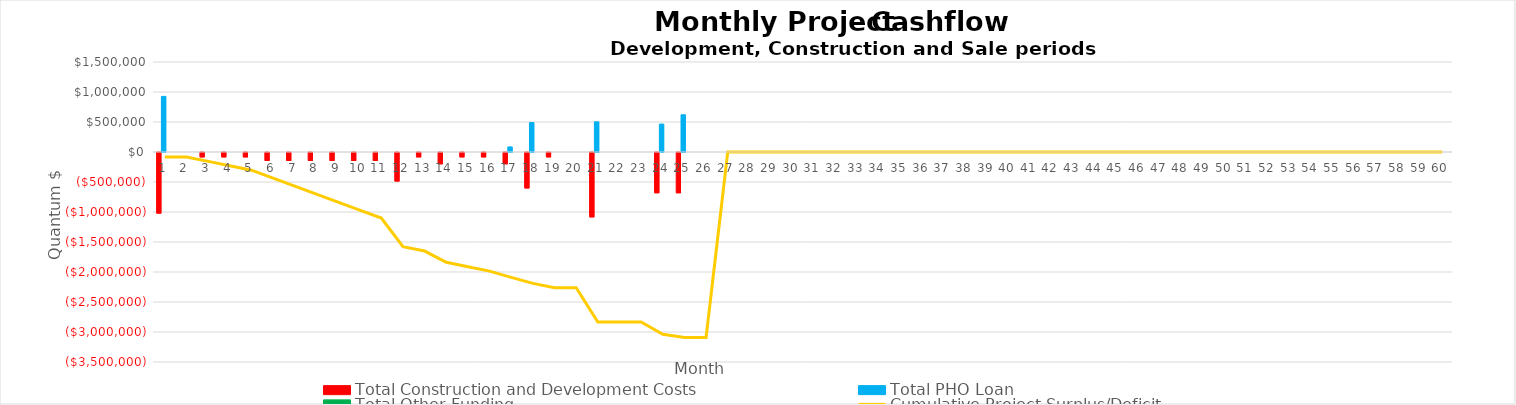
| Category | Total Construction and Development Costs | Total PHO Loan    | Total Other Funding |
|---|---|---|---|
| 0 | -1010000 | 926932.5 | 0 |
| 1 | 0 | 0 | 0 |
| 2 | -73208.824 | 0 | 0 |
| 3 | -73208.824 | 0 | 0 |
| 4 | -73208.824 | 0 | 0 |
| 5 | -133208.824 | 0 | 0 |
| 6 | -133208.824 | 0 | 0 |
| 7 | -133208.824 | 0 | 0 |
| 8 | -133208.824 | 0 | 0 |
| 9 | -133208.824 | 0 | 0 |
| 10 | -133208.824 | 0 | 0 |
| 11 | -475708.824 | 0 | 0 |
| 12 | -73208.824 | 0 | 0 |
| 13 | -188208.824 | 0 | 0 |
| 14 | -73208.824 | 0 | 0 |
| 15 | -73208.824 | 0 | 0 |
| 16 | -188208.824 | 84431.875 | 0 |
| 17 | -590708.824 | 489792.083 | 0 |
| 18 | -73208.824 | 0 | 0 |
| 19 | 0 | 0 | 0 |
| 20 | -1073333.333 | 502955 | 0 |
| 21 | 0 | 0 | 0 |
| 22 | 0 | 0 | 0 |
| 23 | -670833.333 | 465284.375 | 0 |
| 24 | -670833.333 | 620379.167 | 0 |
| 25 | 0 | 0 | 0 |
| 26 | 0 | 0 | 0 |
| 27 | 0 | 0 | 0 |
| 28 | 0 | 0 | 0 |
| 29 | 0 | 0 | 0 |
| 30 | 0 | 0 | 0 |
| 31 | 0 | 0 | 0 |
| 32 | 0 | 0 | 0 |
| 33 | 0 | 0 | 0 |
| 34 | 0 | 0 | 0 |
| 35 | 0 | 0 | 0 |
| 36 | 0 | 0 | 0 |
| 37 | 0 | 0 | 0 |
| 38 | 0 | 0 | 0 |
| 39 | 0 | 0 | 0 |
| 40 | 0 | 0 | 0 |
| 41 | 0 | 0 | 0 |
| 42 | 0 | 0 | 0 |
| 43 | 0 | 0 | 0 |
| 44 | 0 | 0 | 0 |
| 45 | 0 | 0 | 0 |
| 46 | 0 | 0 | 0 |
| 47 | 0 | 0 | 0 |
| 48 | 0 | 0 | 0 |
| 49 | 0 | 0 | 0 |
| 50 | 0 | 0 | 0 |
| 51 | 0 | 0 | 0 |
| 52 | 0 | 0 | 0 |
| 53 | 0 | 0 | 0 |
| 54 | 0 | 0 | 0 |
| 55 | 0 | 0 | 0 |
| 56 | 0 | 0 | 0 |
| 57 | 0 | 0 | 0 |
| 58 | 0 | 0 | 0 |
| 59 | 0 | 0 | 0 |